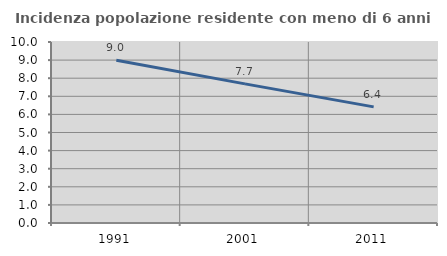
| Category | Incidenza popolazione residente con meno di 6 anni |
|---|---|
| 1991.0 | 8.991 |
| 2001.0 | 7.687 |
| 2011.0 | 6.417 |